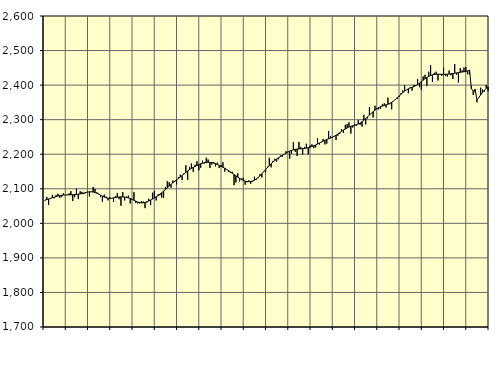
| Category | Piggar | Series 1 |
|---|---|---|
| nan | 2065.5 | 2067.15 |
| 1.0 | 2076.4 | 2068.86 |
| 1.0 | 2053.3 | 2070.5 |
| 1.0 | 2073.1 | 2072.2 |
| 1.0 | 2082.4 | 2073.96 |
| 1.0 | 2072.5 | 2075.69 |
| 1.0 | 2081.6 | 2077.54 |
| 1.0 | 2085.7 | 2079.04 |
| 1.0 | 2074.3 | 2080.4 |
| 1.0 | 2075.6 | 2081.34 |
| 1.0 | 2086.9 | 2081.89 |
| 1.0 | 2081.4 | 2082.15 |
| nan | 2082.7 | 2082.22 |
| 2.0 | 2086.7 | 2082.32 |
| 2.0 | 2093.1 | 2082.53 |
| 2.0 | 2064.5 | 2082.85 |
| 2.0 | 2075.7 | 2083.17 |
| 2.0 | 2100.1 | 2083.56 |
| 2.0 | 2070.1 | 2084.14 |
| 2.0 | 2092.8 | 2085 |
| 2.0 | 2091.2 | 2086.24 |
| 2.0 | 2084.6 | 2087.76 |
| 2.0 | 2087.3 | 2089.25 |
| 2.0 | 2090.8 | 2090.48 |
| nan | 2077.9 | 2091.2 |
| 3.0 | 2090.7 | 2091.23 |
| 3.0 | 2105.1 | 2090.53 |
| 3.0 | 2099.4 | 2089.14 |
| 3.0 | 2089.8 | 2087.1 |
| 3.0 | 2085.7 | 2084.52 |
| 3.0 | 2075.9 | 2081.61 |
| 3.0 | 2062.6 | 2078.7 |
| 3.0 | 2082.9 | 2076.05 |
| 3.0 | 2077.4 | 2073.99 |
| 3.0 | 2066.5 | 2072.72 |
| 3.0 | 2075.7 | 2072.34 |
| nan | 2073 | 2072.79 |
| 4.0 | 2061.8 | 2073.7 |
| 4.0 | 2078.7 | 2074.71 |
| 4.0 | 2087 | 2075.59 |
| 4.0 | 2069.7 | 2076.24 |
| 4.0 | 2051 | 2076.55 |
| 4.0 | 2090.1 | 2076.46 |
| 4.0 | 2066.2 | 2076.01 |
| 4.0 | 2077.3 | 2075.13 |
| 4.0 | 2080.3 | 2073.66 |
| 4.0 | 2057.2 | 2071.76 |
| 4.0 | 2067.3 | 2069.46 |
| nan | 2090.1 | 2066.82 |
| 5.0 | 2058.9 | 2064.19 |
| 5.0 | 2057.8 | 2061.87 |
| 5.0 | 2057.8 | 2060.1 |
| 5.0 | 2063.6 | 2059.19 |
| 5.0 | 2063.3 | 2059.38 |
| 5.0 | 2044 | 2060.51 |
| 5.0 | 2060.1 | 2062.31 |
| 5.0 | 2071.2 | 2064.61 |
| 5.0 | 2052.7 | 2067.28 |
| 5.0 | 2088.5 | 2070.24 |
| 5.0 | 2093.8 | 2073.48 |
| nan | 2066.3 | 2076.93 |
| 6.0 | 2083.7 | 2080.58 |
| 6.0 | 2081 | 2084.49 |
| 6.0 | 2074.5 | 2088.72 |
| 6.0 | 2074.1 | 2093.23 |
| 6.0 | 2105.4 | 2097.89 |
| 6.0 | 2121.9 | 2102.8 |
| 6.0 | 2119 | 2107.85 |
| 6.0 | 2103.4 | 2112.76 |
| 6.0 | 2123.8 | 2117.47 |
| 6.0 | 2119.5 | 2121.91 |
| 6.0 | 2112.8 | 2125.96 |
| nan | 2133.2 | 2129.88 |
| 7.0 | 2140.6 | 2134 |
| 7.0 | 2125.3 | 2138.3 |
| 7.0 | 2144.9 | 2142.81 |
| 7.0 | 2168.2 | 2147.34 |
| 7.0 | 2126.1 | 2151.6 |
| 7.0 | 2163.3 | 2155.42 |
| 7.0 | 2173.1 | 2158.83 |
| 7.0 | 2148.8 | 2161.93 |
| 7.0 | 2169.4 | 2164.85 |
| 7.0 | 2179.8 | 2167.52 |
| 7.0 | 2153.4 | 2170.02 |
| nan | 2160.9 | 2172.27 |
| 8.0 | 2181.3 | 2174.05 |
| 8.0 | 2173 | 2175.38 |
| 8.0 | 2189.8 | 2176.26 |
| 8.0 | 2184.8 | 2176.59 |
| 8.0 | 2160 | 2176.37 |
| 8.0 | 2170 | 2175.64 |
| 8.0 | 2177.7 | 2174.32 |
| 8.0 | 2164.7 | 2172.51 |
| 8.0 | 2176 | 2170.28 |
| 8.0 | 2160 | 2167.74 |
| 8.0 | 2169.1 | 2165.01 |
| nan | 2176.7 | 2162.18 |
| 9.0 | 2149.7 | 2159.23 |
| 9.0 | 2155.5 | 2156.06 |
| 9.0 | 2149.2 | 2152.64 |
| 9.0 | 2146.4 | 2148.99 |
| 9.0 | 2149.2 | 2145.22 |
| 9.0 | 2110.5 | 2141.38 |
| 9.0 | 2118.3 | 2137.52 |
| 9.0 | 2144.9 | 2133.76 |
| 9.0 | 2121.6 | 2130.21 |
| 9.0 | 2129.6 | 2127.02 |
| 9.0 | 2131.8 | 2124.36 |
| nan | 2111.7 | 2122.33 |
| 10.0 | 2118.8 | 2121.07 |
| 10.0 | 2124.2 | 2120.63 |
| 10.0 | 2114.6 | 2121.1 |
| 10.0 | 2120.6 | 2122.55 |
| 10.0 | 2134.9 | 2124.98 |
| 10.0 | 2126.3 | 2128.39 |
| 10.0 | 2130.9 | 2132.75 |
| 10.0 | 2142.3 | 2137.84 |
| 10.0 | 2132.9 | 2143.46 |
| 10.0 | 2150.5 | 2149.45 |
| 10.0 | 2146.9 | 2155.51 |
| nan | 2164.1 | 2161.44 |
| 11.0 | 2189.7 | 2167.16 |
| 11.0 | 2162 | 2172.55 |
| 11.0 | 2180.7 | 2177.45 |
| 11.0 | 2186.9 | 2181.88 |
| 11.0 | 2179 | 2185.97 |
| 11.0 | 2185.5 | 2189.72 |
| 11.0 | 2196.4 | 2193.2 |
| 11.0 | 2192 | 2196.6 |
| 11.0 | 2199.4 | 2199.94 |
| 11.0 | 2208.6 | 2203.16 |
| 11.0 | 2207.3 | 2206.2 |
| nan | 2186.7 | 2208.92 |
| 12.0 | 2201.9 | 2211.11 |
| 12.0 | 2235.3 | 2212.76 |
| 12.0 | 2207.1 | 2214.02 |
| 12.0 | 2194.8 | 2214.83 |
| 12.0 | 2235.5 | 2215.33 |
| 12.0 | 2221.1 | 2215.73 |
| 12.0 | 2199.2 | 2216.13 |
| 12.0 | 2221 | 2216.73 |
| 12.0 | 2230.3 | 2217.71 |
| 12.0 | 2199.6 | 2218.98 |
| 12.0 | 2225.1 | 2220.48 |
| nan | 2228.7 | 2222.28 |
| 13.0 | 2217.5 | 2224.38 |
| 13.0 | 2219.4 | 2226.81 |
| 13.0 | 2246.2 | 2229.49 |
| 13.0 | 2227.9 | 2232.4 |
| 13.0 | 2234.4 | 2235.31 |
| 13.0 | 2243.9 | 2238 |
| 13.0 | 2228.4 | 2240.47 |
| 13.0 | 2230.7 | 2242.71 |
| 13.0 | 2267.3 | 2244.67 |
| 13.0 | 2252.8 | 2246.71 |
| 13.0 | 2247.7 | 2249.12 |
| nan | 2252.8 | 2251.89 |
| 14.0 | 2241.2 | 2255.07 |
| 14.0 | 2253.5 | 2258.58 |
| 14.0 | 2258.3 | 2262.26 |
| 14.0 | 2272.5 | 2266.01 |
| 14.0 | 2261.9 | 2269.67 |
| 14.0 | 2285.2 | 2273.12 |
| 14.0 | 2287 | 2276.24 |
| 14.0 | 2292.1 | 2278.83 |
| 14.0 | 2259.9 | 2280.77 |
| 14.0 | 2277.3 | 2282.25 |
| 14.0 | 2287.9 | 2283.61 |
| nan | 2281.9 | 2285.2 |
| 15.0 | 2298.8 | 2287.35 |
| 15.0 | 2285.4 | 2290.31 |
| 15.0 | 2279.8 | 2294.05 |
| 15.0 | 2313.9 | 2298.43 |
| 15.0 | 2286.2 | 2303.29 |
| 15.0 | 2303.4 | 2308.33 |
| 15.0 | 2335.9 | 2313.31 |
| 15.0 | 2318.8 | 2318.2 |
| 15.0 | 2306.5 | 2322.96 |
| 15.0 | 2340.2 | 2327.46 |
| 15.0 | 2333.8 | 2331.42 |
| nan | 2329.6 | 2334.74 |
| 16.0 | 2332.2 | 2337.41 |
| 16.0 | 2344.4 | 2339.51 |
| 16.0 | 2347.4 | 2341.23 |
| 16.0 | 2335.3 | 2342.86 |
| 16.0 | 2363.6 | 2344.72 |
| 16.0 | 2344.5 | 2347.15 |
| 16.0 | 2329.8 | 2350.24 |
| 16.0 | 2353.4 | 2353.98 |
| 16.0 | 2358.5 | 2358.4 |
| 16.0 | 2359.7 | 2363.23 |
| 16.0 | 2365.7 | 2368.22 |
| nan | 2376.8 | 2373.33 |
| 17.0 | 2384.2 | 2378.25 |
| 17.0 | 2399.5 | 2382.6 |
| 17.0 | 2386.3 | 2386.31 |
| 17.0 | 2376.6 | 2389.33 |
| 17.0 | 2393.5 | 2391.67 |
| 17.0 | 2384 | 2393.69 |
| 17.0 | 2400.7 | 2395.86 |
| 17.0 | 2400 | 2398.47 |
| 17.0 | 2417.7 | 2401.67 |
| 17.0 | 2394 | 2405.52 |
| 17.0 | 2386.5 | 2409.86 |
| nan | 2425.1 | 2414.29 |
| 18.0 | 2429.9 | 2418.47 |
| 18.0 | 2397.9 | 2422.19 |
| 18.0 | 2438.8 | 2425.28 |
| 18.0 | 2457.8 | 2427.74 |
| 18.0 | 2409.1 | 2429.65 |
| 18.0 | 2435.6 | 2430.83 |
| 18.0 | 2438.8 | 2431.37 |
| 18.0 | 2413.4 | 2431.53 |
| 18.0 | 2429.5 | 2431.47 |
| 18.0 | 2426.6 | 2431.34 |
| 18.0 | 2450.5 | 2431.32 |
| nan | 2427 | 2431.37 |
| 19.0 | 2424.5 | 2431.53 |
| 19.0 | 2442.2 | 2431.97 |
| 19.0 | 2428.5 | 2432.66 |
| 19.0 | 2417.7 | 2433.41 |
| 19.0 | 2460.9 | 2434.27 |
| 19.0 | 2429.9 | 2435.29 |
| 19.0 | 2408 | 2436.3 |
| 19.0 | 2449.3 | 2437.17 |
| 19.0 | 2442.6 | 2437.93 |
| 19.0 | 2451 | 2438.67 |
| 19.0 | 2451.9 | 2439.6 |
| nan | 2431.3 | 2441.09 |
| 20.0 | 2430.3 | 2443.54 |
| 20.0 | 2397.1 | 2389.87 |
| 20.0 | 2371.3 | 2382.11 |
| 20.0 | 2378.8 | 2388 |
| 20.0 | 2350.1 | 2357.15 |
| 20.0 | 2363.3 | 2364.36 |
| 20.0 | 2392.6 | 2371.78 |
| 20.0 | 2387.1 | 2378.91 |
| 20.0 | 2381.3 | 2385.22 |
| 20.0 | 2400.6 | 2390.52 |
| 20.0 | 2382.6 | 2394.79 |